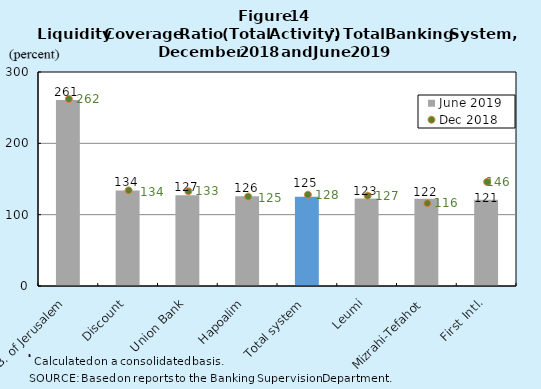
| Category | June 2019 |
|---|---|
| B. of Jerusalem | 260.649 |
| Discount | 134 |
| Union Bank | 127.176 |
| Hapoalim | 125.918 |
| Total system | 125 |
| Leumi | 122.558 |
| Mizrahi-Tefahot | 122.393 |
| First Intl. | 121.068 |